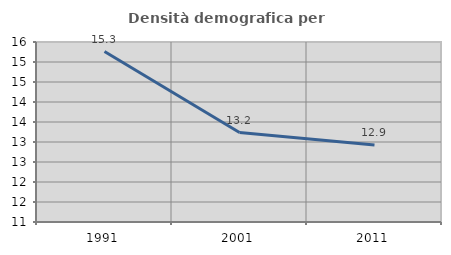
| Category | Densità demografica |
|---|---|
| 1991.0 | 15.262 |
| 2001.0 | 13.237 |
| 2011.0 | 12.926 |